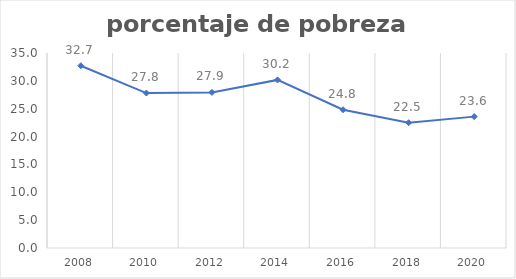
| Category | Series 0 |
|---|---|
| 2008.0 | 32.716 |
| 2010.0 | 27.811 |
| 2012.0 | 27.926 |
| 2014.0 | 30.171 |
| 2016.0 | 24.815 |
| 2018.0 | 22.487 |
| 2020.0 | 23.58 |